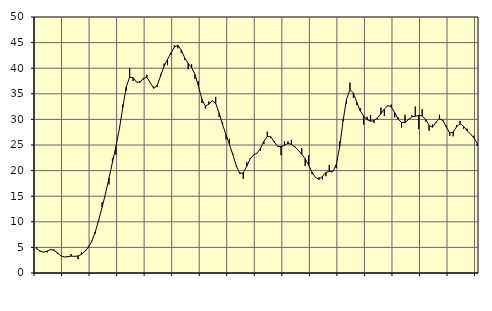
| Category | Piggar | Series 1 |
|---|---|---|
| nan | 5 | 4.7 |
| 87.0 | 4.2 | 4.3 |
| 87.0 | 4 | 4.08 |
| 87.0 | 4 | 4.28 |
| nan | 4.7 | 4.57 |
| 88.0 | 4.6 | 4.46 |
| 88.0 | 3.7 | 3.93 |
| 88.0 | 3.3 | 3.37 |
| nan | 3.1 | 3.12 |
| 89.0 | 3.1 | 3.2 |
| 89.0 | 3.7 | 3.29 |
| 89.0 | 3.2 | 3.25 |
| nan | 2.7 | 3.33 |
| 90.0 | 4.1 | 3.64 |
| 90.0 | 4.3 | 4.24 |
| 90.0 | 5.2 | 5.01 |
| nan | 6.3 | 6.19 |
| 91.0 | 7.7 | 8.01 |
| 91.0 | 10.2 | 10.33 |
| 91.0 | 13.8 | 12.85 |
| nan | 15.7 | 15.53 |
| 92.0 | 17.3 | 18.55 |
| 92.0 | 22.4 | 21.61 |
| 92.0 | 23.1 | 24.68 |
| nan | 28.1 | 28.09 |
| 93.0 | 32.9 | 32.32 |
| 93.0 | 35.6 | 36.3 |
| 93.0 | 40 | 38.25 |
| nan | 37.5 | 38.15 |
| 94.0 | 37.3 | 37.27 |
| 94.0 | 37.5 | 37.26 |
| 94.0 | 37.8 | 38.04 |
| nan | 38.7 | 38.19 |
| 95.0 | 37.1 | 37.15 |
| 95.0 | 36.4 | 36.08 |
| 95.0 | 36.3 | 36.63 |
| nan | 38.8 | 38.52 |
| 96.0 | 40.9 | 40.38 |
| 96.0 | 40.6 | 41.73 |
| 96.0 | 42.6 | 42.98 |
| nan | 44.5 | 44.12 |
| 97.0 | 43.9 | 44.49 |
| 97.0 | 43 | 43.54 |
| 97.0 | 41.6 | 42.02 |
| nan | 39.8 | 40.91 |
| 98.0 | 40.8 | 40.12 |
| 98.0 | 37.9 | 38.77 |
| 98.0 | 37.5 | 36.44 |
| nan | 33.2 | 33.9 |
| 99.0 | 32.1 | 32.62 |
| 99.0 | 33.5 | 32.94 |
| 99.0 | 33.7 | 33.64 |
| nan | 34.4 | 33.14 |
| 0.0 | 30.5 | 31.25 |
| 0.0 | 29.4 | 28.95 |
| 0.0 | 26.1 | 27.02 |
| nan | 26.2 | 25.12 |
| 1.0 | 23.2 | 23.06 |
| 1.0 | 20.7 | 20.93 |
| 1.0 | 19.7 | 19.45 |
| nan | 18.4 | 19.55 |
| 2.0 | 21.7 | 20.84 |
| 2.0 | 22.4 | 22.27 |
| 2.0 | 23.1 | 23.03 |
| nan | 23.4 | 23.43 |
| 3.0 | 23.9 | 24.34 |
| 3.0 | 25.2 | 25.69 |
| 3.0 | 27.6 | 26.68 |
| nan | 26.4 | 26.6 |
| 4.0 | 25.7 | 25.59 |
| 4.0 | 24.7 | 24.76 |
| 4.0 | 23 | 24.67 |
| nan | 25.7 | 24.97 |
| 5.0 | 25.7 | 25.3 |
| 5.0 | 26 | 25.12 |
| 5.0 | 24.7 | 24.62 |
| nan | 24 | 23.95 |
| 6.0 | 24.4 | 23.18 |
| 6.0 | 20.9 | 22.33 |
| 6.0 | 23 | 21.04 |
| nan | 19.3 | 19.68 |
| 7.0 | 18.6 | 18.64 |
| 7.0 | 18.7 | 18.29 |
| 7.0 | 18.3 | 18.86 |
| nan | 18.9 | 19.65 |
| 8.0 | 21.1 | 19.83 |
| 8.0 | 19.8 | 19.78 |
| 8.0 | 20.5 | 21.11 |
| nan | 25.7 | 24.56 |
| 9.0 | 30 | 29.63 |
| 9.0 | 33.1 | 33.91 |
| 9.0 | 37.2 | 35.79 |
| nan | 34.2 | 35.17 |
| 10.0 | 32.8 | 33.31 |
| 10.0 | 32.2 | 31.69 |
| 10.0 | 29 | 30.63 |
| nan | 30.5 | 29.94 |
| 11.0 | 30.8 | 29.65 |
| 11.0 | 29.3 | 29.76 |
| 11.0 | 30 | 30.29 |
| nan | 32.3 | 31.1 |
| 12.0 | 30.7 | 32.03 |
| 12.0 | 32.8 | 32.67 |
| 12.0 | 32.9 | 32.46 |
| nan | 30.4 | 31.34 |
| 13.0 | 30.4 | 30.04 |
| 13.0 | 28.4 | 29.42 |
| 13.0 | 30.9 | 29.36 |
| nan | 30.1 | 29.95 |
| 14.0 | 30.8 | 30.5 |
| 14.0 | 32.5 | 30.62 |
| 14.0 | 28.1 | 30.79 |
| nan | 32 | 30.68 |
| 15.0 | 29.6 | 30 |
| 15.0 | 27.8 | 28.81 |
| 15.0 | 29 | 28.48 |
| nan | 29.3 | 29.44 |
| 16.0 | 30.9 | 30.11 |
| 16.0 | 29.7 | 29.82 |
| 16.0 | 28.8 | 28.55 |
| nan | 26.8 | 27.35 |
| 17.0 | 26.7 | 27.51 |
| 17.0 | 28.9 | 28.56 |
| 17.0 | 29.7 | 29.15 |
| nan | 28.2 | 28.66 |
| 18.0 | 28.2 | 27.8 |
| 18.0 | 27.2 | 27.19 |
| 18.0 | 26.8 | 26.37 |
| nan | 24.8 | 25.3 |